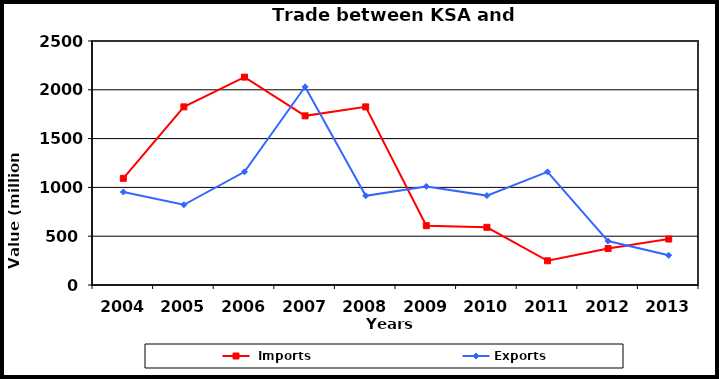
| Category |  Imports | Exports |
|---|---|---|
| 2004.0 | 1093 | 953 |
| 2005.0 | 1825 | 822 |
| 2006.0 | 2130 | 1160 |
| 2007.0 | 1733 | 2031 |
| 2008.0 | 1825 | 914 |
| 2009.0 | 608 | 1010 |
| 2010.0 | 591 | 916 |
| 2011.0 | 248 | 1159 |
| 2012.0 | 373 | 450 |
| 2013.0 | 471 | 304 |